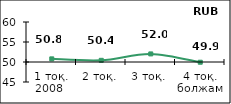
| Category | Диффузионный индекс* |
|---|---|
| 1 тоқ. 2008  | 50.785 |
| 2 тоқ. | 50.42 |
| 3 тоқ. | 52.02 |
| 4 тоқ. болжам | 49.945 |